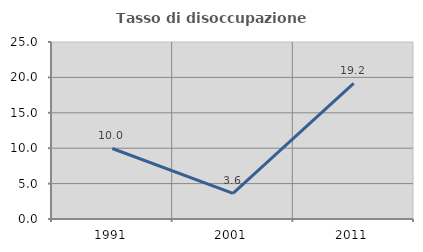
| Category | Tasso di disoccupazione giovanile  |
|---|---|
| 1991.0 | 9.959 |
| 2001.0 | 3.614 |
| 2011.0 | 19.167 |